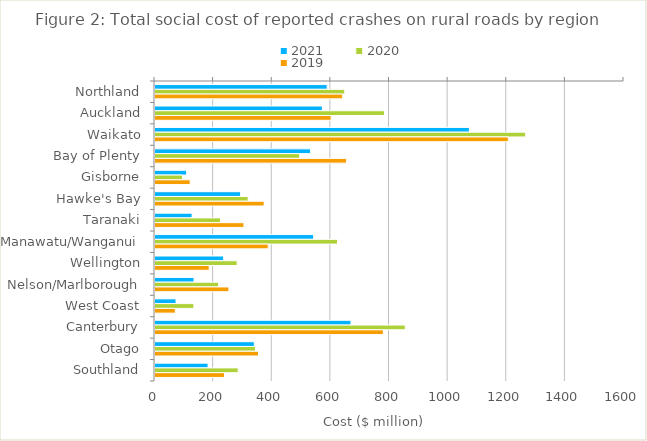
| Category | 2021 | 2020 | 2019 |
|---|---|---|---|
| Northland | 587.328 | 647.287 | 640.231 |
| Auckland | 570.92 | 782.856 | 600.827 |
| Waikato | 1072.586 | 1264.592 | 1205.414 |
| Bay of Plenty | 530.626 | 493.633 | 653.733 |
| Gisborne | 107.871 | 93.604 | 119.832 |
| Hawke's Bay | 292.151 | 317.713 | 372.417 |
| Taranaki | 126.62 | 223.669 | 303.321 |
| Manawatu/Wanganui | 541.167 | 622.559 | 386.406 |
| Wellington | 234.202 | 280.358 | 184.772 |
| Nelson/Marlborough | 133.098 | 217.245 | 252.162 |
| West Coast | 71.709 | 132.557 | 69.226 |
| Canterbury | 668.552 | 853.784 | 778.959 |
| Otago | 338.71 | 342.837 | 353.073 |
| Southland | 180.984 | 283.895 | 237.044 |